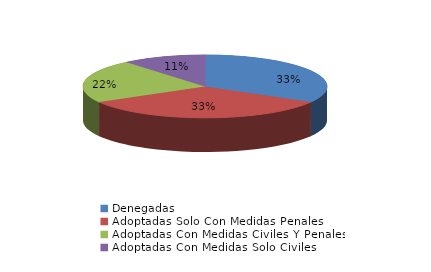
| Category | Series 0 |
|---|---|
| Denegadas | 3 |
| Adoptadas Solo Con Medidas Penales | 3 |
| Adoptadas Con Medidas Civiles Y Penales | 2 |
| Adoptadas Con Medidas Solo Civiles | 1 |